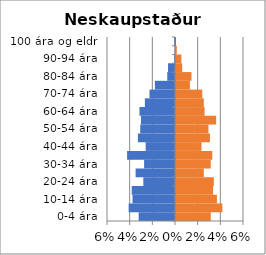
| Category | % karlar | %konur |
|---|---|---|
| 0-4 ára | -0.032 | 0.031 |
| 5-9 ára | -0.041 | 0.041 |
| 10-14 ára | -0.037 | 0.036 |
| 15-19 ára | -0.038 | 0.033 |
| 20-24 ára | -0.028 | 0.033 |
| 25-29 ára | -0.035 | 0.025 |
| 30-34 ára | -0.027 | 0.031 |
| 35-39 ára | -0.042 | 0.032 |
| 40-44 ára | -0.026 | 0.022 |
| 45-49 ára | -0.033 | 0.03 |
| 50-54 ára | -0.031 | 0.029 |
| 55-59 ára | -0.03 | 0.035 |
| 60-64 ára | -0.031 | 0.025 |
| 65-69 ára | -0.027 | 0.025 |
| 70-74 ára | -0.022 | 0.023 |
| 75-79 ára | -0.018 | 0.012 |
| 80-84 ára | -0.007 | 0.014 |
| 85-89 ára | -0.006 | 0.005 |
| 90-94 ára | -0.001 | 0.005 |
| 95-99 ára | 0 | 0.001 |
| 100 ára og eldri | -0.001 | 0 |